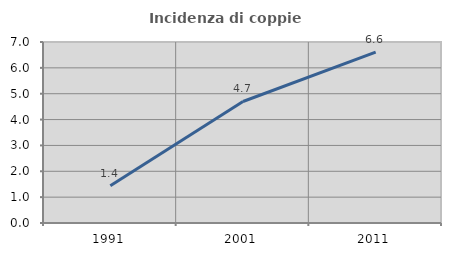
| Category | Incidenza di coppie miste |
|---|---|
| 1991.0 | 1.44 |
| 2001.0 | 4.7 |
| 2011.0 | 6.61 |